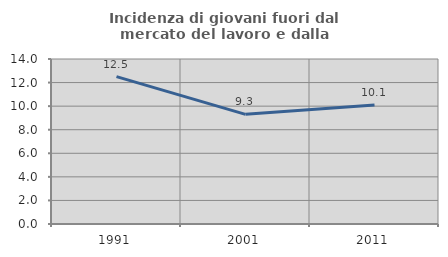
| Category | Incidenza di giovani fuori dal mercato del lavoro e dalla formazione  |
|---|---|
| 1991.0 | 12.5 |
| 2001.0 | 9.302 |
| 2011.0 | 10.092 |